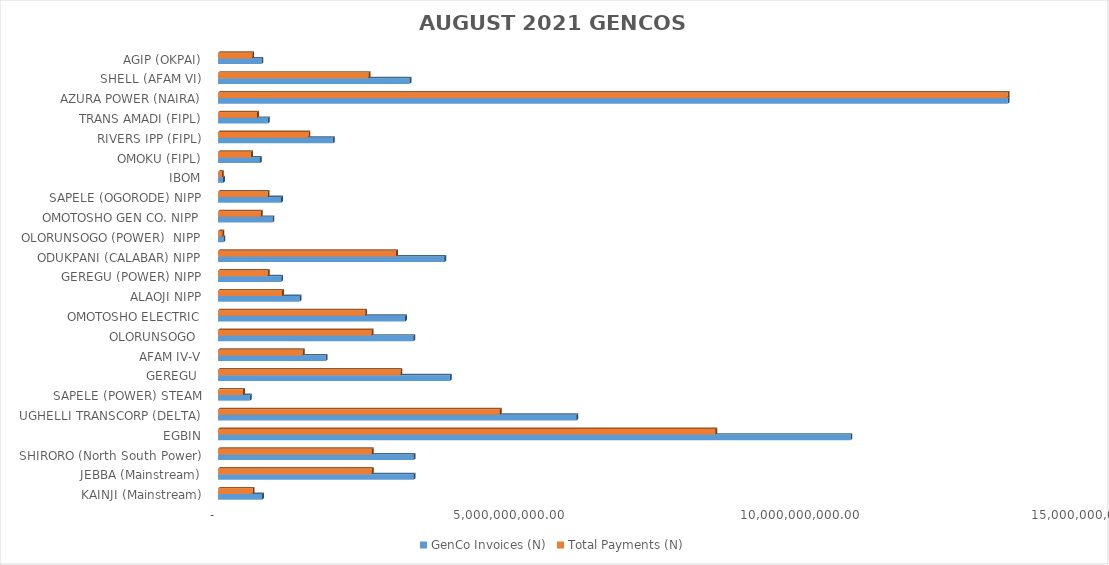
| Category | GenCo Invoices (N) | Total Payments (N) |
|---|---|---|
| KAINJI (Mainstream) | 756861529.17 | 595275299.647 |
| JEBBA (Mainstream) | 3358282631.1 | 2641305737.551 |
| SHIRORO (North South Power) | 3359682981.49 | 2642407119.991 |
| EGBIN | 10865234155.95 | 8545559879.379 |
| UGHELLI TRANSCORP (DELTA) | 6156727863.28 | 4842296618.88 |
| SAPELE (POWER) STEAM | 547537000.1 | 430640532.304 |
| GEREGU  | 3984331413.14 | 3133696170.886 |
| AFAM IV-V | 1849680802.89 | 1454783010.836 |
| OLORUNSOGO  | 3354392378.13 | 2638246034.536 |
| OMOTOSHO ELECTRIC | 3214008278.7 | 2527833252.761 |
| ALAOJI NIPP | 1399207390 | 1100483465.27 |
| GEREGU (POWER) NIPP | 1084992106.59 | 853351605.905 |
| ODUKPANI (CALABAR) NIPP | 3888998760.38 | 3058716572.57 |
| OLORUNSOGO (POWER)  NIPP | 92403928.91 | 72676142.664 |
| OMOTOSHO GEN CO. NIPP | 934696908.92 | 735143696.822 |
| SAPELE (OGORODE) NIPP | 1084024274.58 | 852590401.289 |
| IBOM | 85305958.7 | 67093554.329 |
| OMOKU (FIPL) | 718926402.1 | 565439136.408 |
| RIVERS IPP (FIPL) | 1973955849.73 | 1552525943.85 |
| TRANS AMADI (FIPL) | 853411013.34 | 671211941.827 |
| AZURA POWER (NAIRA) | 13567568185.051 | 13567568185.049 |
| SHELL (AFAM VI) | 3288889104.852 | 2586727389.281 |
| AGIP (OKPAI) | 744984562.796 | 585934007.423 |